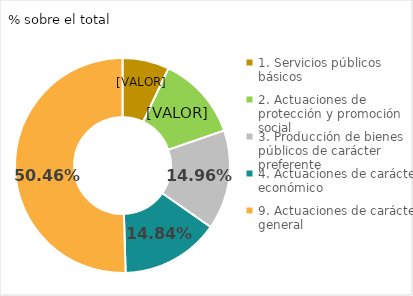
| Category | Series 0 |
|---|---|
| Red local de carreteras | 0.61 |
| Obras y mantenimiento de recintos | 0.111 |
| Vías Azules Barcelona | 0.071 |
| Recursos informáticos | 0.061 |
| Otras inversiones | 0.147 |